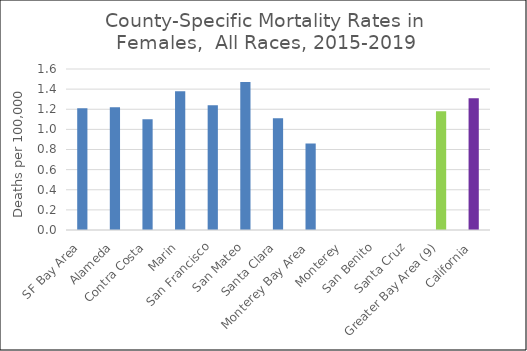
| Category | Female |
|---|---|
| SF Bay Area | 1.21 |
|   Alameda | 1.22 |
|   Contra Costa | 1.1 |
|   Marin | 1.38 |
|   San Francisco | 1.24 |
|   San Mateo | 1.47 |
|   Santa Clara | 1.11 |
| Monterey Bay Area | 0.86 |
|   Monterey | 0 |
|   San Benito | 0 |
|   Santa Cruz | 0 |
| Greater Bay Area (9) | 1.18 |
| California | 1.31 |